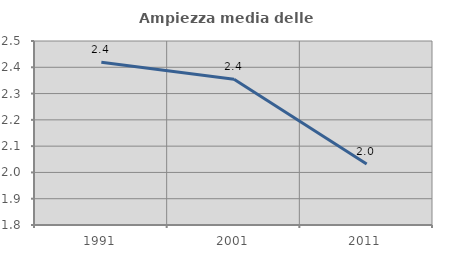
| Category | Ampiezza media delle famiglie |
|---|---|
| 1991.0 | 2.419 |
| 2001.0 | 2.355 |
| 2011.0 | 2.032 |